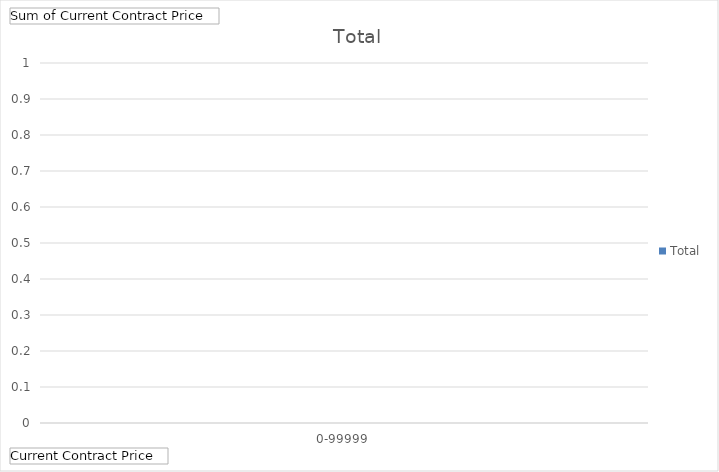
| Category | Total |
|---|---|
| 0-99999 | 0 |